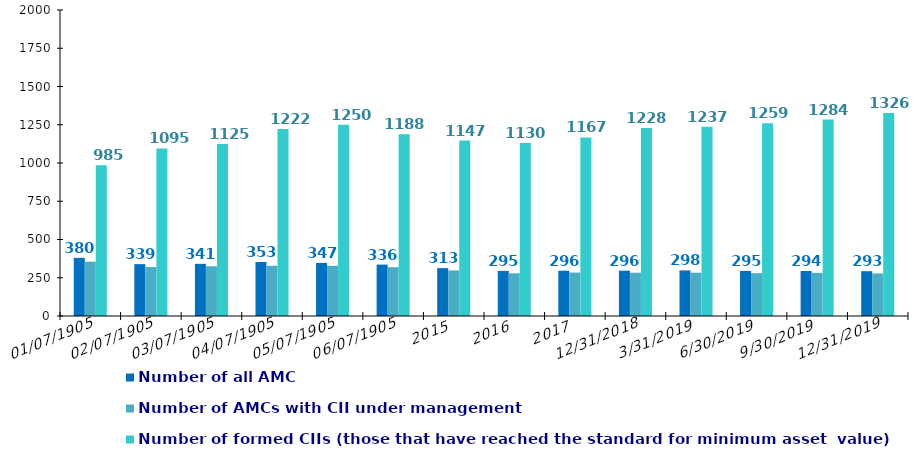
| Category | Number of registered CIIs per one AMC | Number of all AMC    | Number of AMCs with CII under management
 | Number of formed CIIs (those that have reached the standard for minimum asset  value) |
|---|---|---|---|---|
| 2009 |  | 380 | 355 | 985 |
| 2010 |  | 339 | 320 | 1095 |
| 2011 |  | 341 | 325 | 1125 |
| 2012 |  | 353 | 328 | 1222 |
| 2013 |  | 347 | 328 | 1250 |
| 2014 |  | 336 | 319 | 1188 |
| 2015 |  | 313 | 298 | 1147 |
| 2016 |  | 295 | 279 | 1130 |
| 2017 |  | 296 | 284 | 1167 |
| 31.12.2018 |  | 296 | 283 | 1228 |
| 31.03.2019 |  | 298 | 283 | 1237 |
| 30.06.2019 |  | 295 | 280 | 1259 |
| 30.09.2019 |  | 294 | 282 | 1284 |
| 31.12.2019 |  | 293 | 278 | 1326 |